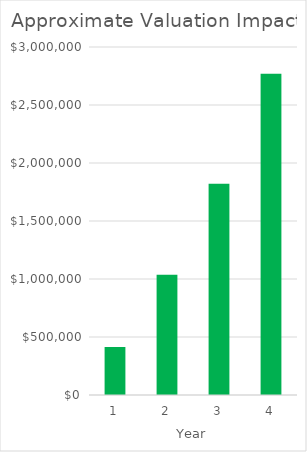
| Category | Series 1 |
|---|---|
| 0 | 413322.656 |
| 1 | 1035721.094 |
| 2 | 1821711.719 |
| 3 | 2769927.344 |